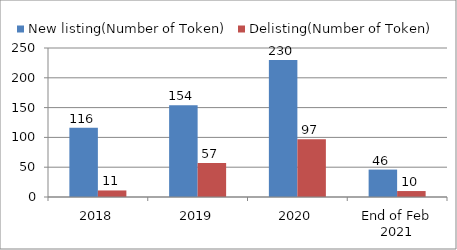
| Category | New listing(Number of Token) | Delisting(Number of Token) |
|---|---|---|
| 2018 | 116 | 11 |
| 2019 | 154 | 57 |
| 2020 | 230 | 97 |
| End of Feb 2021 | 46 | 10 |